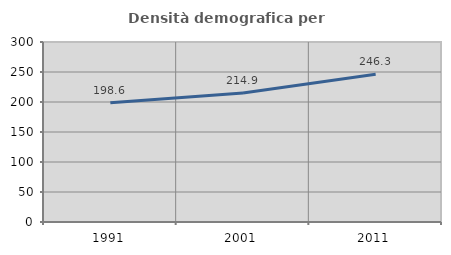
| Category | Densità demografica |
|---|---|
| 1991.0 | 198.602 |
| 2001.0 | 214.934 |
| 2011.0 | 246.293 |